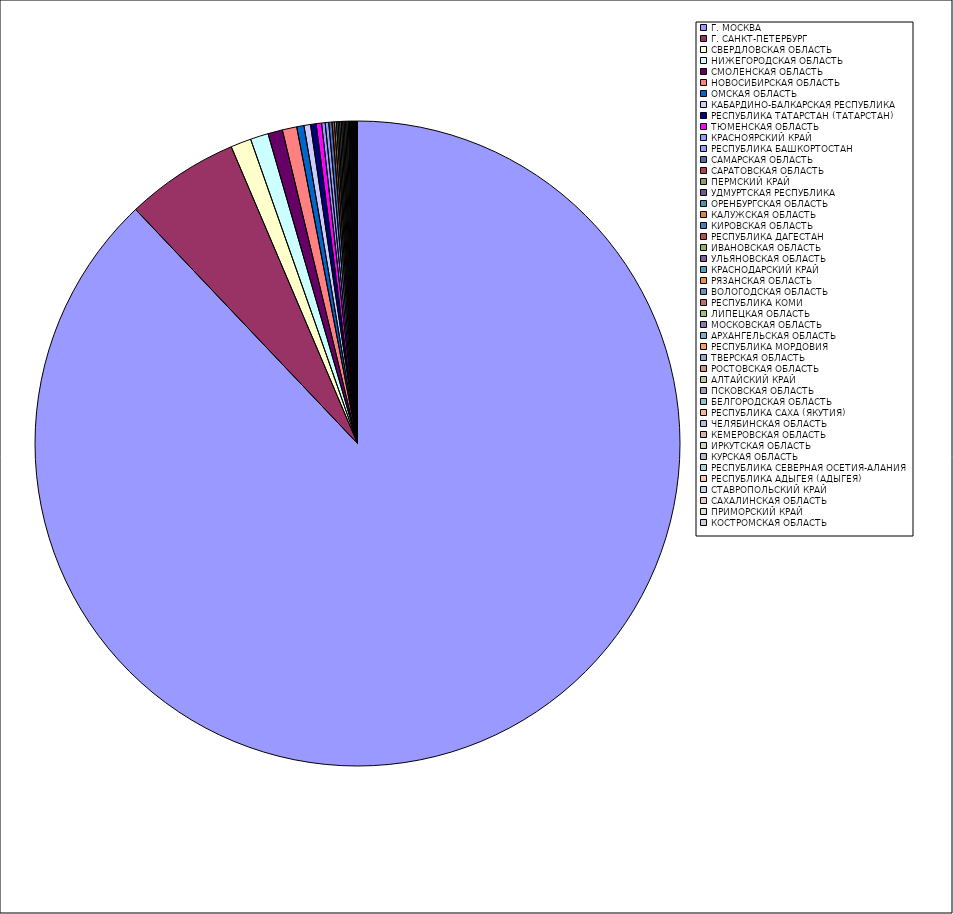
| Category | Оборот |
|---|---|
| Г. МОСКВА | 87.896 |
| Г. САНКТ-ПЕТЕРБУРГ | 5.673 |
| СВЕРДЛОВСКАЯ ОБЛАСТЬ | 1.027 |
| НИЖЕГОРОДСКАЯ ОБЛАСТЬ | 0.898 |
| СМОЛЕНСКАЯ ОБЛАСТЬ | 0.731 |
| НОВОСИБИРСКАЯ ОБЛАСТЬ | 0.724 |
| ОМСКАЯ ОБЛАСТЬ | 0.363 |
| КАБАРДИНО-БАЛКАРСКАЯ РЕСПУБЛИКА | 0.327 |
| РЕСПУБЛИКА ТАТАРСТАН (ТАТАРСТАН) | 0.279 |
| ТЮМЕНСКАЯ ОБЛАСТЬ | 0.272 |
| КРАСНОЯРСКИЙ КРАЙ | 0.178 |
| РЕСПУБЛИКА БАШКОРТОСТАН | 0.177 |
| САМАРСКАЯ ОБЛАСТЬ | 0.162 |
| САРАТОВСКАЯ ОБЛАСТЬ | 0.118 |
| ПЕРМСКИЙ КРАЙ | 0.098 |
| УДМУРТСКАЯ РЕСПУБЛИКА | 0.083 |
| ОРЕНБУРГСКАЯ ОБЛАСТЬ | 0.08 |
| КАЛУЖСКАЯ ОБЛАСТЬ | 0.078 |
| КИРОВСКАЯ ОБЛАСТЬ | 0.073 |
| РЕСПУБЛИКА ДАГЕСТАН | 0.071 |
| ИВАНОВСКАЯ ОБЛАСТЬ | 0.068 |
| УЛЬЯНОВСКАЯ ОБЛАСТЬ | 0.067 |
| КРАСНОДАРСКИЙ КРАЙ | 0.067 |
| РЯЗАНСКАЯ ОБЛАСТЬ | 0.051 |
| ВОЛОГОДСКАЯ ОБЛАСТЬ | 0.048 |
| РЕСПУБЛИКА КОМИ | 0.047 |
| ЛИПЕЦКАЯ ОБЛАСТЬ | 0.038 |
| МОСКОВСКАЯ ОБЛАСТЬ | 0.032 |
| АРХАНГЕЛЬСКАЯ ОБЛАСТЬ | 0.028 |
| РЕСПУБЛИКА МОРДОВИЯ | 0.027 |
| ТВЕРСКАЯ ОБЛАСТЬ | 0.026 |
| РОСТОВСКАЯ ОБЛАСТЬ | 0.019 |
| АЛТАЙСКИЙ КРАЙ | 0.017 |
| ПСКОВСКАЯ ОБЛАСТЬ | 0.014 |
| БЕЛГОРОДСКАЯ ОБЛАСТЬ | 0.013 |
| РЕСПУБЛИКА САХА (ЯКУТИЯ) | 0.012 |
| ЧЕЛЯБИНСКАЯ ОБЛАСТЬ | 0.011 |
| КЕМЕРОВСКАЯ ОБЛАСТЬ | 0.011 |
| ИРКУТСКАЯ ОБЛАСТЬ | 0.01 |
| КУРСКАЯ ОБЛАСТЬ | 0.009 |
| РЕСПУБЛИКА СЕВЕРНАЯ ОСЕТИЯ-АЛАНИЯ | 0.009 |
| РЕСПУБЛИКА АДЫГЕЯ (АДЫГЕЯ) | 0.008 |
| СТАВРОПОЛЬСКИЙ КРАЙ | 0.008 |
| САХАЛИНСКАЯ ОБЛАСТЬ | 0.007 |
| ПРИМОРСКИЙ КРАЙ | 0.006 |
| КОСТРОМСКАЯ ОБЛАСТЬ | 0.006 |